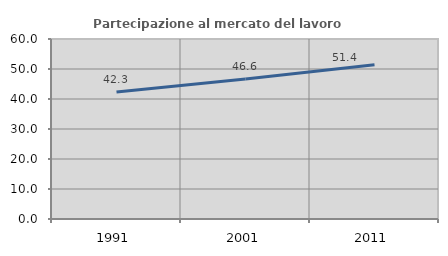
| Category | Partecipazione al mercato del lavoro  femminile |
|---|---|
| 1991.0 | 42.34 |
| 2001.0 | 46.647 |
| 2011.0 | 51.424 |